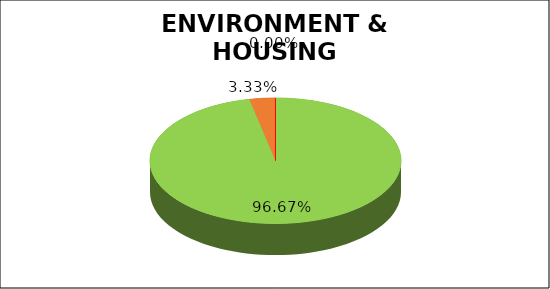
| Category | Q2 |
|---|---|
| Green | 0.967 |
| Amber | 0.033 |
| Red | 0 |